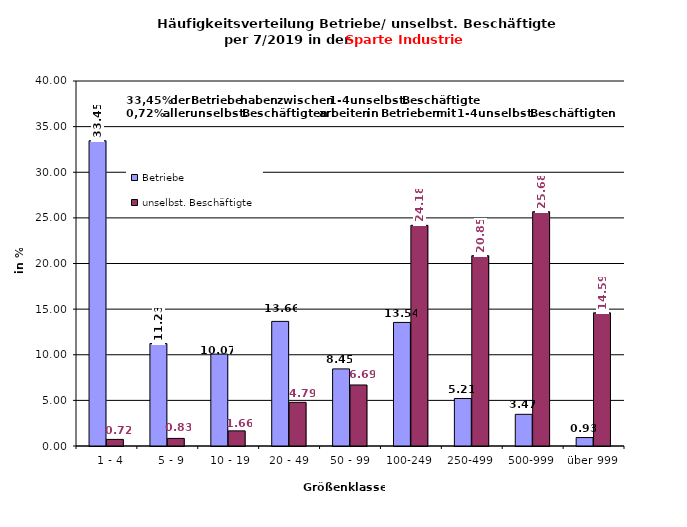
| Category | Betriebe | unselbst. Beschäftigte |
|---|---|---|
|   1 - 4 | 33.449 | 0.723 |
|   5 - 9 | 11.227 | 0.834 |
|  10 - 19 | 10.069 | 1.658 |
| 20 - 49 | 13.657 | 4.787 |
| 50 - 99 | 8.449 | 6.688 |
| 100-249 | 13.542 | 24.184 |
| 250-499 | 5.208 | 20.854 |
| 500-999 | 3.472 | 25.677 |
| über 999 | 0.926 | 14.595 |